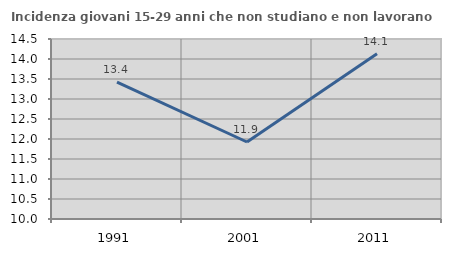
| Category | Incidenza giovani 15-29 anni che non studiano e non lavorano  |
|---|---|
| 1991.0 | 13.422 |
| 2001.0 | 11.925 |
| 2011.0 | 14.133 |